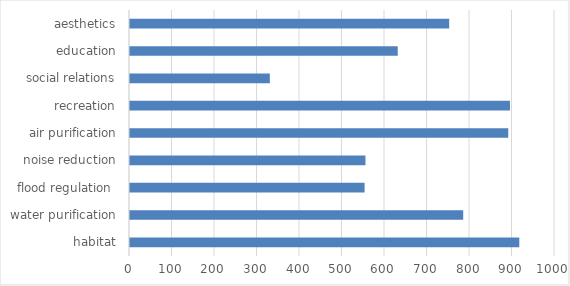
| Category | Series 0 |
|---|---|
| habitat | 916 |
| water purification | 784 |
| flood regulation  | 552 |
| noise reduction | 554 |
| air purification | 890 |
| recreation | 894 |
| social relations | 329 |
| education | 630 |
| aesthetics | 751 |